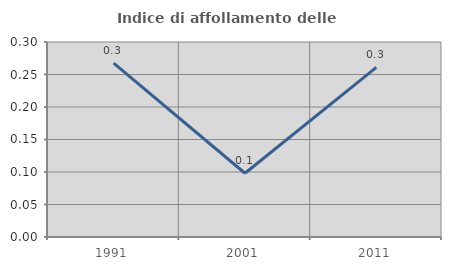
| Category | Indice di affollamento delle abitazioni  |
|---|---|
| 1991.0 | 0.268 |
| 2001.0 | 0.098 |
| 2011.0 | 0.261 |